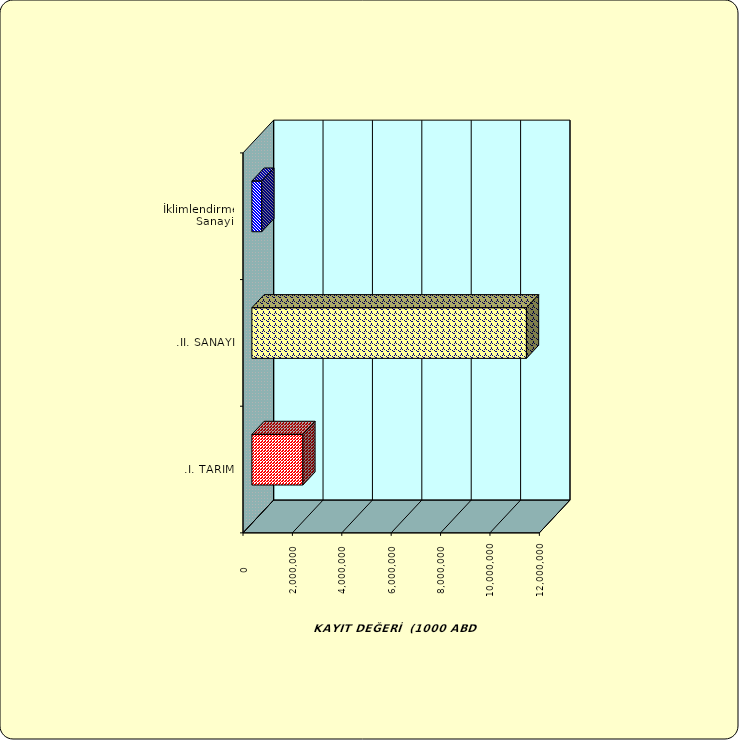
| Category | Series 0 |
|---|---|
| .I. TARIM | 2063951.301 |
| .II. SANAYİ | 11116935.743 |
|  İklimlendirme Sanayii | 401180.805 |